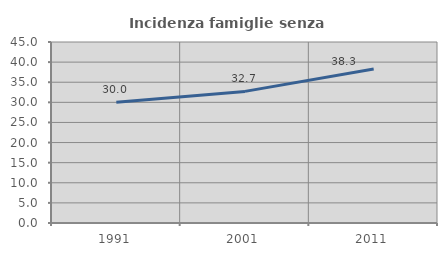
| Category | Incidenza famiglie senza nuclei |
|---|---|
| 1991.0 | 30.011 |
| 2001.0 | 32.719 |
| 2011.0 | 38.288 |